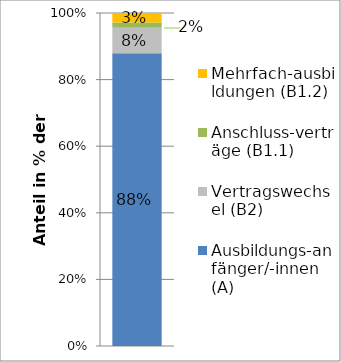
| Category | Ausbildungs-anfänger/-innen (A) | Vertragswechsel (B2) | Anschluss-verträge (B1.1) | Mehrfach-ausbildungen (B1.2) |
|---|---|---|---|---|
| 0 | 0.879 | 0.076 | 0.016 | 0.029 |